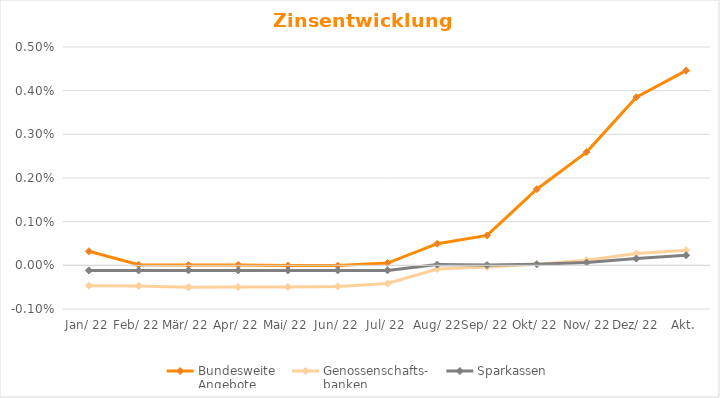
| Category | Bundesweite
Angebote | Genossenschafts-
banken | Sparkassen |
|---|---|---|---|
| Jan. 22 | 0 | 0 | 0 |
| Feb. 22 | 0 | 0 | 0 |
| Mrz. 22 | 0 | -0.001 | 0 |
| Apr. 22 | 0 | 0 | 0 |
| Mai. 22 | 0 | 0 | 0 |
| Jun. 22 | 0 | 0 | 0 |
| Jul. 22 | 0 | 0 | 0 |
| Aug. 22 | 0 | 0 | 0 |
| Sep. 22 | 0.001 | 0 | 0 |
| Okt. 22 | 0.002 | 0 | 0 |
| Nov. 22 | 0.003 | 0 | 0 |
| Dez. 22 | 0.004 | 0 | 0 |
| Akt. | 0.004 | 0 | 0 |